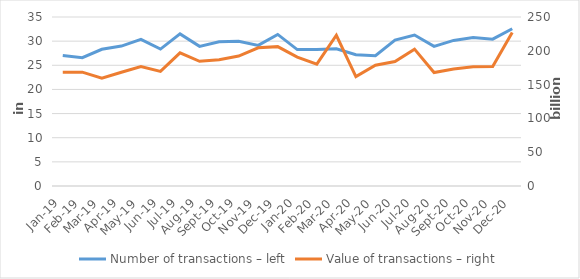
| Category | Number of transactions – left |
|---|---|
| sij.19 | 27005568 |
| Feb-19 | 26571736 |
| ožu.19 | 28315672 |
| tra.19 | 28974478 |
| svi.19 | 30360495 |
| lip.19 | 28359379 |
| srp.19 | 31493402 |
| kol.19 | 28920043 |
| ruj.19 | 29864803 |
| lis.19 | 29976491 |
| stu.19 | 29117460 |
| pro.19 | 31391661 |
| sij.20 | 28256095 |
| Feb-20 | 28274985 |
| ožu.20 | 28400981 |
| tra.20 | 27204598 |
| svi.20 | 26966811 |
| lip.20 | 30208024 |
| srp.20 | 31260868 |
| kol.20 | 28920407 |
| ruj.20 | 30154281 |
| lis.20 | 30730172 |
| stu.20 | 30406511 |
| pro.20 | 32570998 |